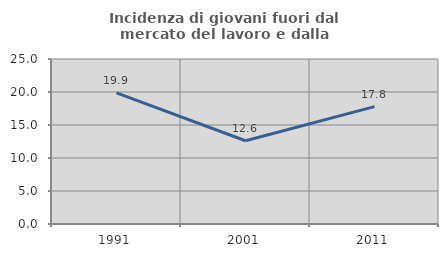
| Category | Incidenza di giovani fuori dal mercato del lavoro e dalla formazione  |
|---|---|
| 1991.0 | 19.868 |
| 2001.0 | 12.613 |
| 2011.0 | 17.778 |